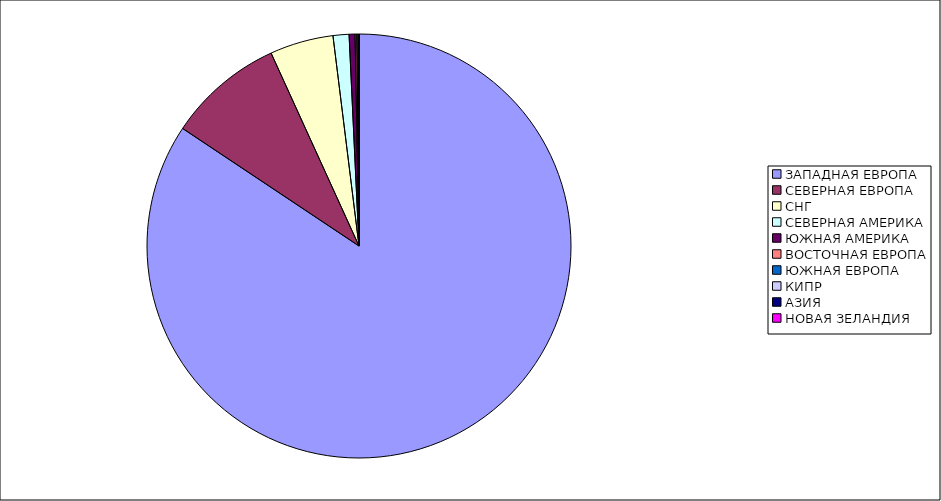
| Category | Оборот |
|---|---|
| ЗАПАДНАЯ ЕВРОПА | 0.844 |
| СЕВЕРНАЯ ЕВРОПА | 0.088 |
| СНГ | 0.048 |
| СЕВЕРНАЯ АМЕРИКА | 0.012 |
| ЮЖНАЯ АМЕРИКА | 0.004 |
| ВОСТОЧНАЯ ЕВРОПА | 0.001 |
| ЮЖНАЯ ЕВРОПА | 0.001 |
| КИПР | 0 |
| АЗИЯ | 0 |
| НОВАЯ ЗЕЛАНДИЯ | 0 |